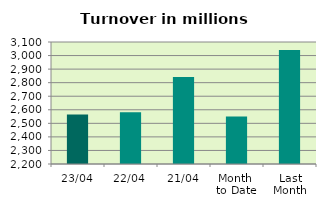
| Category | Series 0 |
|---|---|
| 23/04 | 2565.314 |
| 22/04 | 2581.359 |
| 21/04 | 2841.893 |
| Month 
to Date | 2550.208 |
| Last
Month | 3040.277 |